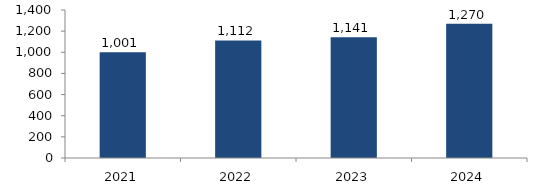
| Category | Bogotá |
|---|---|
| 2021.0 | 1001.441 |
| 2022.0 | 1111.971 |
| 2023.0 | 1141.325 |
| 2024.0 | 1270.258 |